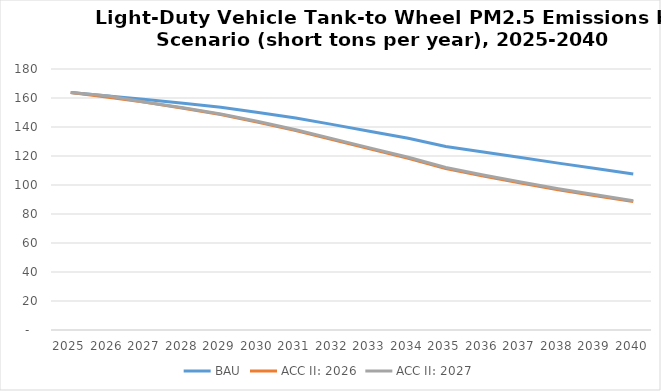
| Category | BAU | ACC II: 2026 | ACC II: 2027 |
|---|---|---|---|
| 2025.0 | 163.833 | 163.833 | 163.833 |
| 2026.0 | 161.413 | 160.593 | 161.413 |
| 2027.0 | 158.986 | 156.981 | 157.126 |
| 2028.0 | 156.405 | 153.003 | 153.243 |
| 2029.0 | 153.661 | 148.644 | 148.986 |
| 2030.0 | 150.062 | 143.285 | 143.73 |
| 2031.0 | 146.228 | 137.592 | 138.135 |
| 2032.0 | 141.629 | 131.177 | 131.803 |
| 2033.0 | 136.948 | 124.756 | 125.446 |
| 2034.0 | 132.213 | 118.389 | 119.124 |
| 2035.0 | 126.501 | 111.278 | 112.032 |
| 2036.0 | 122.692 | 106.113 | 106.875 |
| 2037.0 | 118.912 | 101.339 | 102.081 |
| 2038.0 | 115.095 | 96.761 | 97.468 |
| 2039.0 | 111.349 | 92.563 | 93.211 |
| 2040.0 | 107.579 | 88.585 | 89.157 |